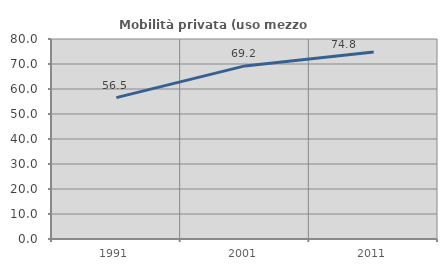
| Category | Mobilità privata (uso mezzo privato) |
|---|---|
| 1991.0 | 56.538 |
| 2001.0 | 69.24 |
| 2011.0 | 74.841 |